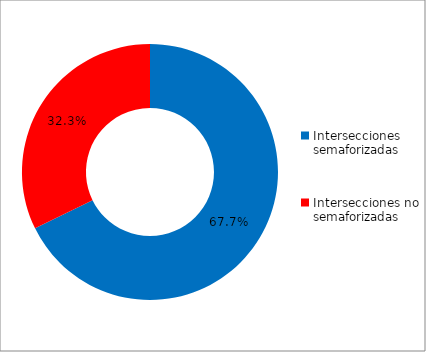
| Category | Series 0 |
|---|---|
| Intersecciones semaforizadas | 0.677 |
| Intersecciones no semaforizadas | 0.323 |